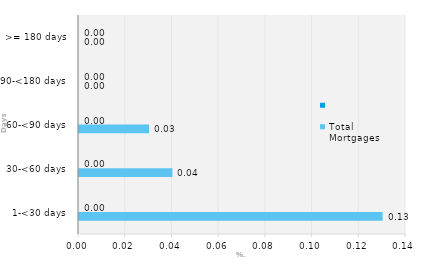
| Category | Total Mortgages | Series 0 |
|---|---|---|
| 1-<30 days | 0.13 |  |
| 30-<60 days | 0.04 |  |
| 60-<90 days | 0.03 |  |
| 90-<180 days | 0 |  |
| >= 180 days | 0 |  |